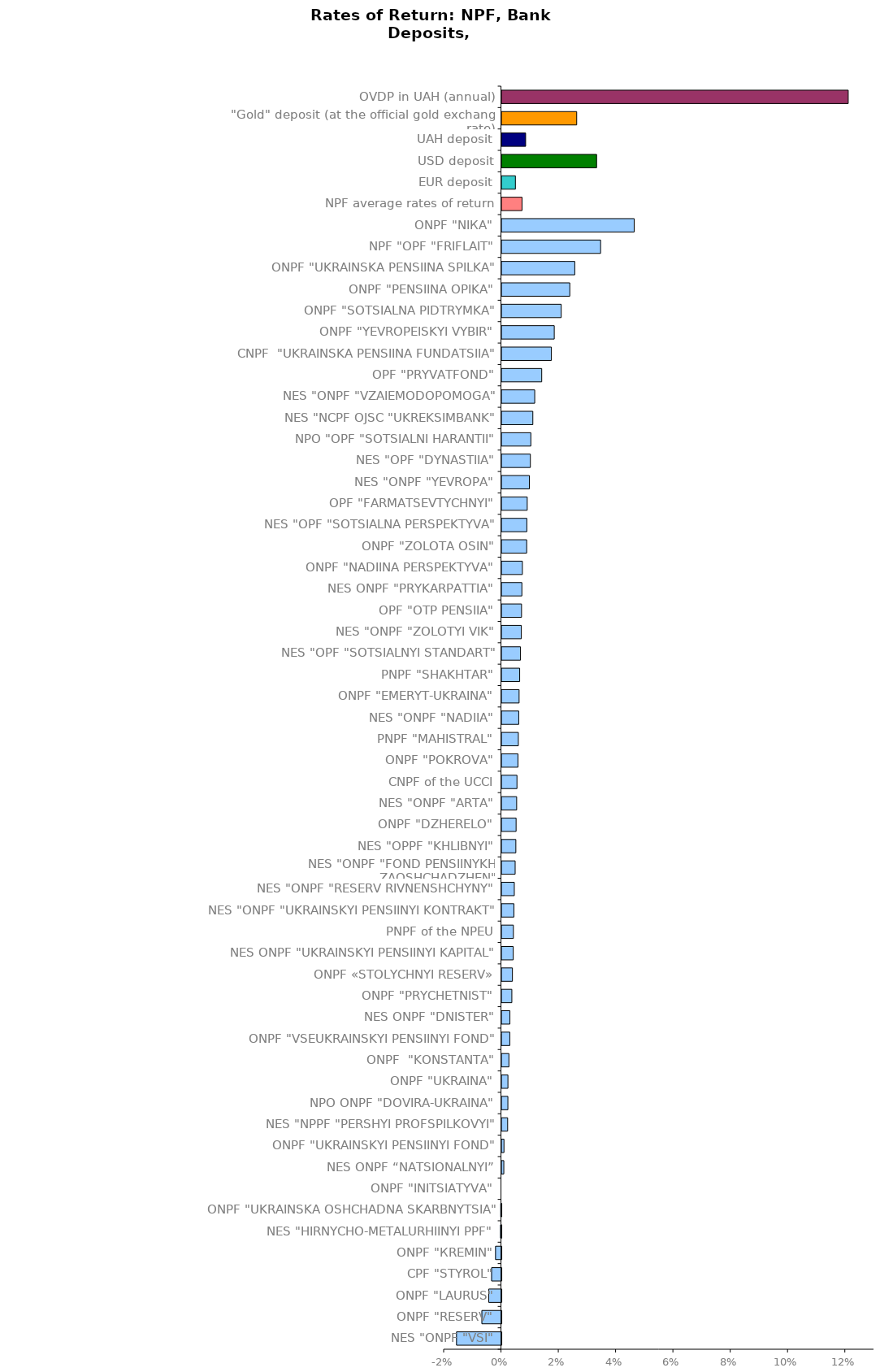
| Category | Series 0 |
|---|---|
| NES "ONPF "VSI" | -0.016 |
| ONPF "RESERV" | -0.007 |
| ONPF "LAURUS" | -0.004 |
| CPF "STYROL" | -0.003 |
| ONPF "КREMIN" | -0.002 |
| NES "HIRNYCHO-METALURHIINYI PPF" | 0 |
| ONPF "UKRAINSKA OSHCHADNA SKARBNYTSIA" | 0 |
| ONPF "INITSIATYVA" | 0 |
| NES ONPF “NATSIONALNYI” | 0.001 |
| ONPF "UKRAINSKYI PENSIINYI FOND" | 0.001 |
| NES "NPPF "PERSHYI PROFSPILKOVYI" | 0.002 |
| NPO ONPF "DOVIRA-UKRAINA" | 0.002 |
| ONPF "UKRAINA" | 0.002 |
| ONPF  "KONSTANTA" | 0.002 |
| ONPF "VSEUKRAINSKYI PENSIINYI FOND" | 0.003 |
| NES ONPF "DNISTER" | 0.003 |
| ONPF "PRYCHETNIST" | 0.004 |
| ONPF «STOLYCHNYI RESERV» | 0.004 |
| NES ONPF "UKRAINSKYI PENSIINYI KAPITAL" | 0.004 |
| PNPF of the NPEU | 0.004 |
| NES "ONPF "UKRAINSKYI PENSIINYI KONTRAKT" | 0.004 |
| NES "ONPF "RESERV RIVNENSHCHYNY" | 0.004 |
| NES "ONPF "FOND PENSIINYKH  ZAOSHCHADZHEN" | 0.005 |
| NES "OPPF "KHLIBNYI" | 0.005 |
| ONPF "DZHERELO" | 0.005 |
| NES "ONPF "АRТА" | 0.005 |
| CNPF of the UCCI | 0.005 |
| ONPF "POKROVA" | 0.006 |
| PNPF "МAHISTRAL" | 0.006 |
| NES "ONPF "NADIIA" | 0.006 |
| ONPF "ЕMERYT-UKRAINA" | 0.006 |
| PNPF "SHAKHTAR" | 0.006 |
| NES "OPF "SOTSIALNYI STANDART" | 0.007 |
| NES "ONPF "ZOLOTYI VIK" | 0.007 |
| OPF "ОТP PENSIIA" | 0.007 |
| NES ONPF "PRYKARPATTIA" | 0.007 |
| ONPF "NADIINA PERSPEKTYVA" | 0.007 |
| ONPF "ZOLOTA OSIN" | 0.009 |
| NES "OPF "SOTSIALNA PERSPEKTYVA" | 0.009 |
| OPF "FARMATSEVTYCHNYI" | 0.009 |
| NES "ONPF "YEVROPA" | 0.01 |
| NES "OPF "DYNASTIIA" | 0.01 |
| NPO "OPF "SOTSIALNI HARANTII" | 0.01 |
| NES "NCPF OJSC "UKREKSIMBANK" | 0.011 |
| NES "ONPF "VZAIEMODOPOMOGA" | 0.011 |
| OPF "PRYVATFOND" | 0.014 |
| CNPF  "UKRAINSKA PENSIINA FUNDATSIIA" | 0.017 |
| ONPF "YEVROPEISKYI VYBIR" | 0.018 |
| ONPF "SOTSIALNA PIDTRYMKA" | 0.021 |
| ONPF "PENSIINA OPIKA" | 0.024 |
| ONPF "UKRAINSKA PENSIINA SPILKA" | 0.025 |
| NPF "OPF "FRIFLAIT" | 0.034 |
| ONPF "NIКА" | 0.046 |
| NPF average rates of return | 0.007 |
| EUR deposit | 0.005 |
| USD deposit | 0.033 |
| UAH deposit | 0.008 |
| "Gold" deposit (at the official gold exchange rate) | 0.026 |
| OVDP in UAH (annual) | 0.121 |